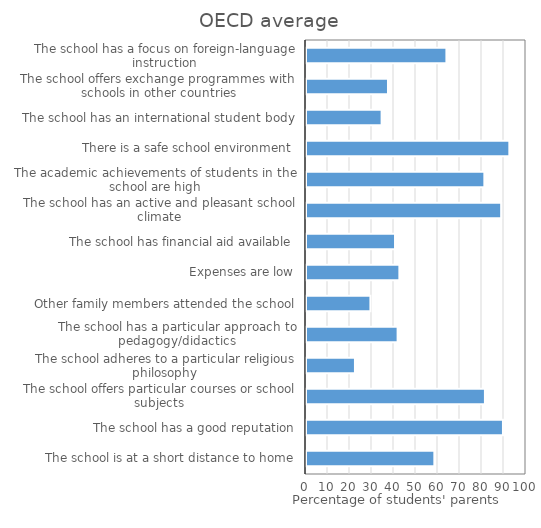
| Category | OECD average |
|---|---|
| The school is at a short distance to home | 58.341 |
| The school has a good reputation | 89.526 |
| The school offers particular courses or school subjects | 81.33 |
| The school adheres to a particular religious philosophy | 22.253 |
| The school has a particular approach to pedagogy/didactics | 41.643 |
| Other family members attended the school | 29.277 |
| Expenses are low | 42.443 |
| The school has financial aid available | 40.467 |
| The school has an active and pleasant school climate | 88.71 |
| The academic achievements of students in the school are high | 81.073 |
| There is a safe school environment | 92.428 |
| The school has an international student body | 34.371 |
| The school offers exchange programmes with schools in other countries | 37.265 |
| The school has a focus on foreign-language instruction | 63.824 |